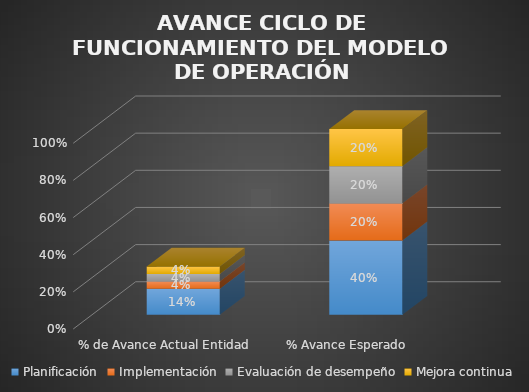
| Category | Planificación | Implementación | Evaluación de desempeño | Mejora continua |
|---|---|---|---|---|
| % de Avance Actual Entidad | 0.14 | 0.04 | 0.04 | 0.04 |
| % Avance Esperado | 0.4 | 0.2 | 0.2 | 0.2 |